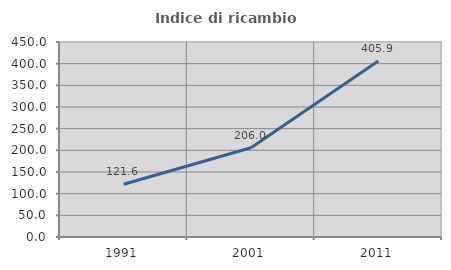
| Category | Indice di ricambio occupazionale  |
|---|---|
| 1991.0 | 121.622 |
| 2001.0 | 205.97 |
| 2011.0 | 405.921 |